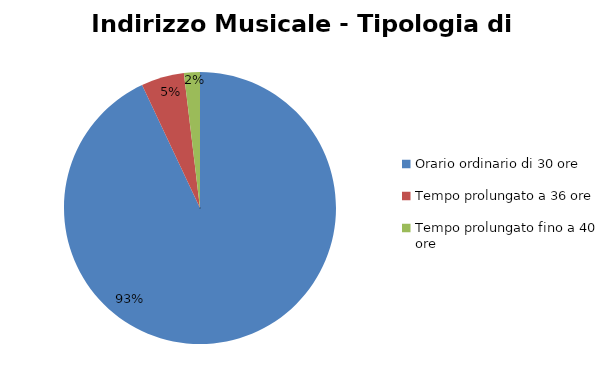
| Category | Series 0 | Series 1 |
|---|---|---|
| Orario ordinario di 30 ore | 2457 |  |
| Tempo prolungato a 36 ore | 135 |  |
| Tempo prolungato fino a 40 ore | 50 |  |